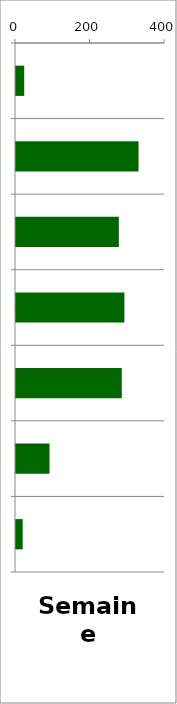
| Category | PL |
|---|---|
| 0 | 22 |
| 1 | 329 |
| 2 | 276 |
| 3 | 291 |
| 4 | 284 |
| 5 | 90 |
| 6 | 18 |